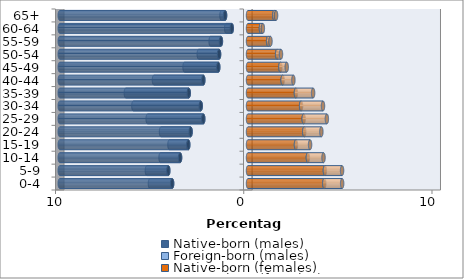
| Category | Native-born (males) | Foreign-born (males) | Native-born (females) | Foreign-born (females) |
|---|---|---|---|---|
| 0-4 | -4.03 | -1.179 | 4.052 | 0.95 |
| 5-9 | -4.234 | -1.137 | 4.085 | 0.912 |
| 10-14 | -3.608 | -1.038 | 3.18 | 0.831 |
| 15-19 | -3.173 | -1 | 2.548 | 0.75 |
| 20-24 | -3.048 | -1.572 | 2.987 | 0.911 |
| 25-29 | -2.377 | -2.954 | 2.958 | 1.231 |
| 30-34 | -2.511 | -3.579 | 2.82 | 1.165 |
| 35-39 | -3.148 | -3.341 | 2.546 | 0.913 |
| 40-44 | -2.373 | -2.622 | 1.84 | 0.571 |
| 45-49 | -1.579 | -1.793 | 1.719 | 0.337 |
| 50-54 | -1.537 | -1.08 | 1.546 | 0.206 |
| 55-59 | -1.439 | -0.547 | 1.069 | 0.126 |
| 60-64 | -0.863 | -0.296 | 0.688 | 0.102 |
| 65+ | -1.218 | -0.191 | 1.396 | 0.095 |